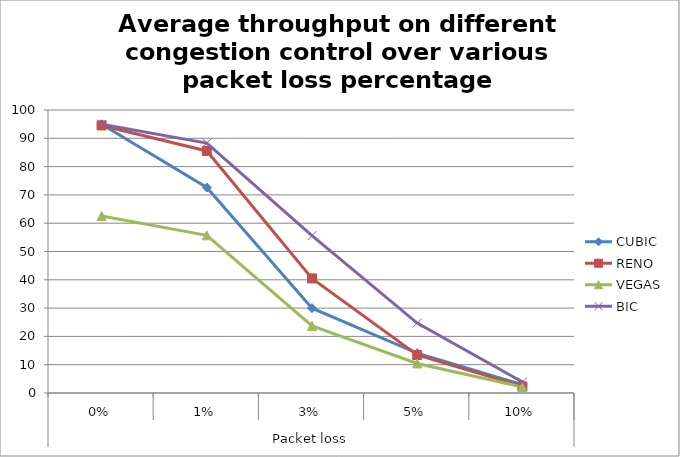
| Category | CUBIC | RENO | VEGAS | BIC |
|---|---|---|---|---|
| 0 | 94.983 | 94.55 | 62.525 | 94.933 |
| 1 | 72.617 | 85.533 | 55.725 | 88.317 |
| 2 | 29.983 | 40.483 | 23.708 | 55.592 |
| 3 | 14.092 | 13.425 | 10.442 | 24.708 |
| 4 | 2.948 | 2.323 | 2.1 | 3.874 |